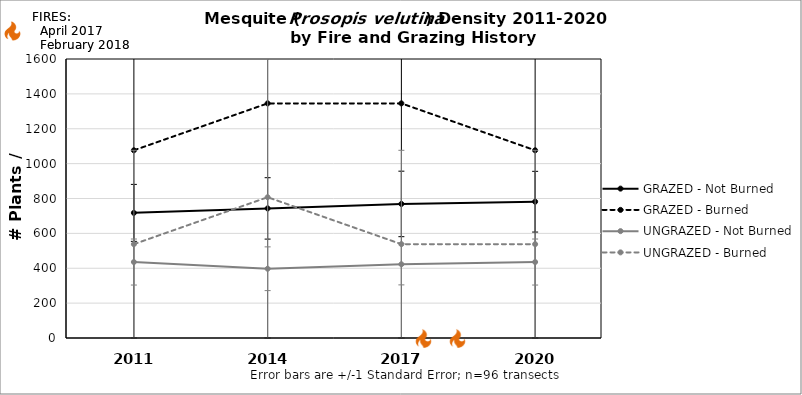
| Category | GRAZED - Not Burned | GRAZED - Burned | UNGRAZED - Not Burned | UNGRAZED - Burned |
|---|---|---|---|---|
| 2011.0 | 717.593 | 1076.39 | 435.682 | 538.195 |
| 2014.0 | 743.222 | 1345.488 | 397.239 | 807.292 |
| 2017.0 | 768.85 | 1345.488 | 422.868 | 538.195 |
| 2020.0 | 781.664 | 1076.39 | 435.682 | 538.195 |